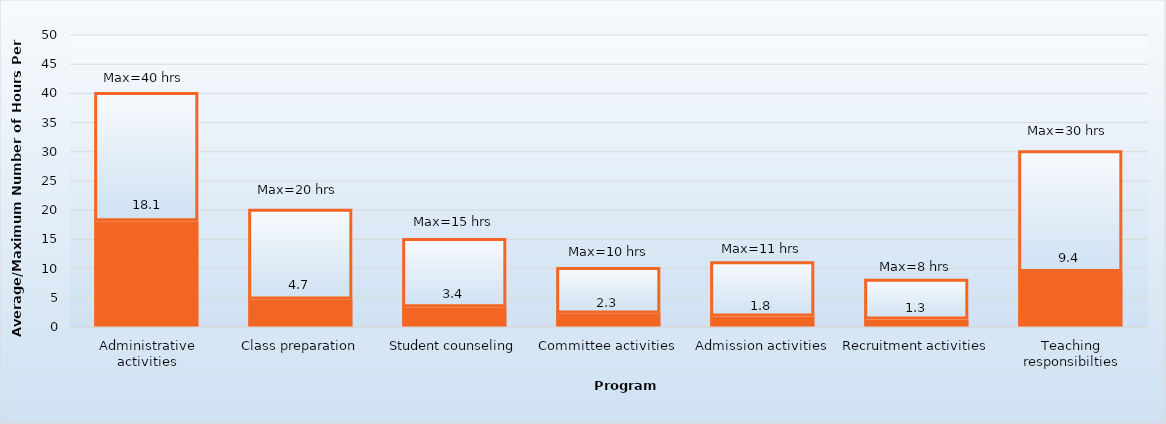
| Category | Average hours per week | Maximum |
|---|---|---|
| Administrative activities | 18.1 | 21.9 |
| Class preparation | 4.7 | 15.3 |
| Student counseling | 3.4 | 11.6 |
| Committee activities | 2.3 | 7.7 |
| Admission activities | 1.8 | 9.2 |
| Recruitment activities | 1.3 | 6.7 |
| Teaching responsibilties | 9.4 | 20.6 |